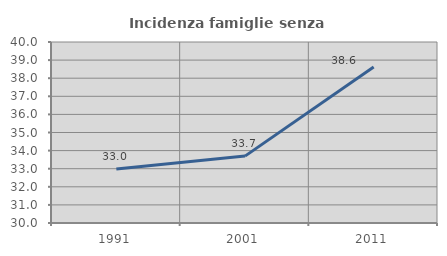
| Category | Incidenza famiglie senza nuclei |
|---|---|
| 1991.0 | 32.979 |
| 2001.0 | 33.696 |
| 2011.0 | 38.614 |